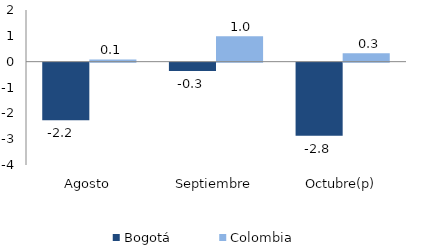
| Category | Bogotá | Colombia |
|---|---|---|
| Agosto | -2.231 | 0.087 |
| Septiembre | -0.324 | 0.982 |
| Octubre(p) | -2.83 | 0.323 |